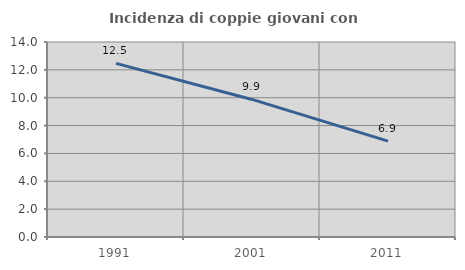
| Category | Incidenza di coppie giovani con figli |
|---|---|
| 1991.0 | 12.468 |
| 2001.0 | 9.877 |
| 2011.0 | 6.881 |